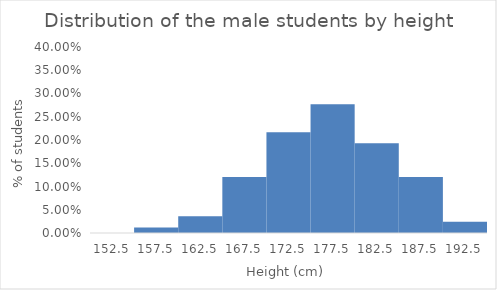
| Category | Series 0 |
|---|---|
| 152.5 | 0 |
| 157.5 | 0.012 |
| 162.5 | 0.036 |
| 167.5 | 0.12 |
| 172.5 | 0.217 |
| 177.5 | 0.277 |
| 182.5 | 0.193 |
| 187.5 | 0.12 |
| 192.5 | 0.024 |